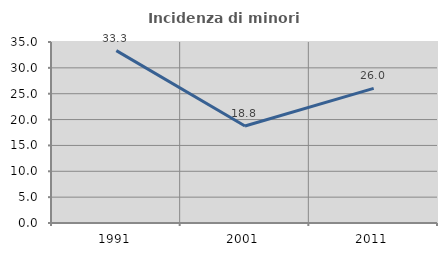
| Category | Incidenza di minori stranieri |
|---|---|
| 1991.0 | 33.333 |
| 2001.0 | 18.75 |
| 2011.0 | 26.027 |